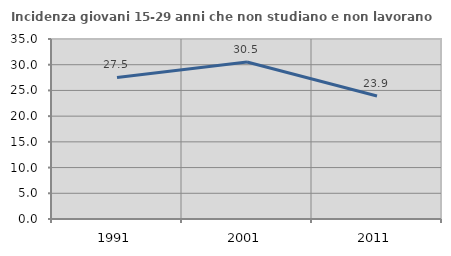
| Category | Incidenza giovani 15-29 anni che non studiano e non lavorano  |
|---|---|
| 1991.0 | 27.52 |
| 2001.0 | 30.514 |
| 2011.0 | 23.922 |